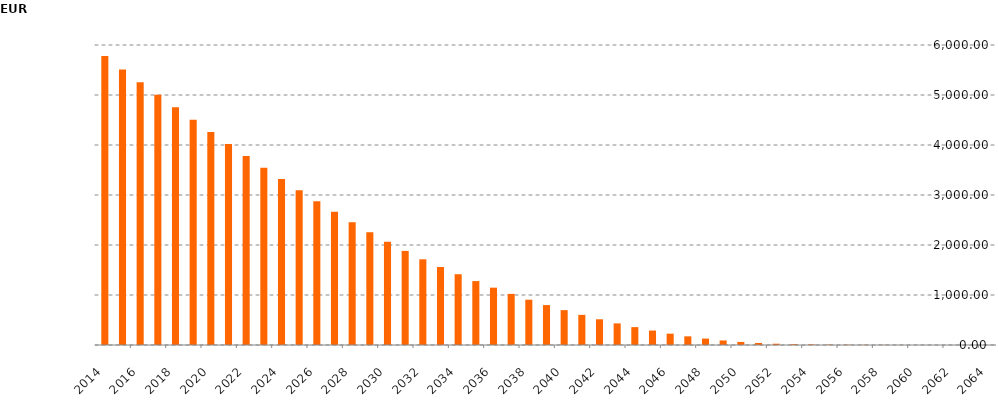
| Category | Series 1 |
|---|---|
| 2014-09-30 | 5780045680.53 |
| 2015-09-30 | 5508571812.29 |
| 2016-09-30 | 5256319069.83 |
| 2017-09-30 | 5004879385.02 |
| 2018-09-30 | 4754469834.03 |
| 2019-09-30 | 4506427157.07 |
| 2020-09-30 | 4261273965.45 |
| 2021-09-30 | 4019062488.01 |
| 2022-09-30 | 3780413045.01 |
| 2023-09-30 | 3546486618.47 |
| 2024-09-30 | 3317715339.24 |
| 2025-09-30 | 3094441933.19 |
| 2026-09-30 | 2876233645.57 |
| 2027-09-30 | 2662958715.5 |
| 2028-09-30 | 2455476973.89 |
| 2029-09-30 | 2255258906.47 |
| 2030-09-30 | 2063097348.49 |
| 2031-09-30 | 1882083202.74 |
| 2032-09-30 | 1713815193.31 |
| 2033-09-30 | 1560350181.5 |
| 2034-09-30 | 1415891412.96 |
| 2035-09-30 | 1278152141.79 |
| 2036-09-30 | 1146868653.94 |
| 2037-09-30 | 1022429009.17 |
| 2038-09-30 | 906293437.07 |
| 2039-09-30 | 798357235.16 |
| 2040-09-30 | 697387288.81 |
| 2041-09-30 | 602884654.86 |
| 2042-09-30 | 514399627.51 |
| 2043-09-30 | 432463496.21 |
| 2044-09-30 | 357551741.44 |
| 2045-09-30 | 288880507.65 |
| 2046-09-30 | 226878777.62 |
| 2047-09-30 | 173230034.68 |
| 2048-09-30 | 128434853.23 |
| 2049-09-30 | 90896003.8 |
| 2050-09-30 | 61405746.56 |
| 2051-09-30 | 40671690.65 |
| 2052-09-30 | 25782008.94 |
| 2053-09-30 | 16638362.64 |
| 2054-09-30 | 11715511.63 |
| 2055-09-30 | 8545102.81 |
| 2056-09-30 | 5958165.65 |
| 2057-09-30 | 3982319.28 |
| 2058-09-30 | 2538781 |
| 2059-09-30 | 1512032.42 |
| 2060-09-30 | 803123.92 |
| 2061-09-30 | 369863.82 |
| 2062-09-30 | 142665.49 |
| 2063-09-30 | 26958.11 |
| 2064-09-30 | 0 |